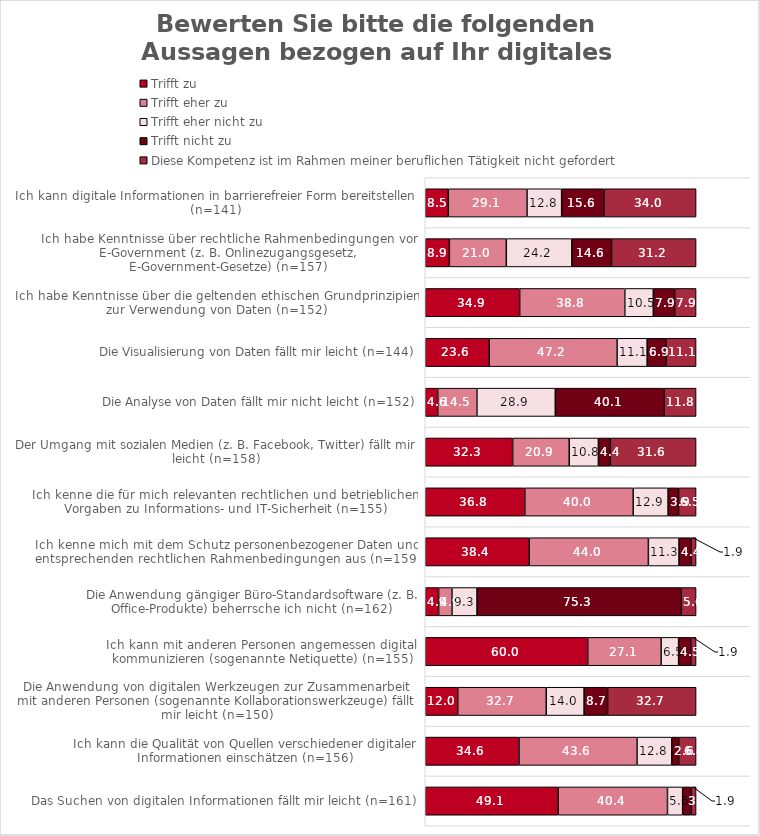
| Category | Trifft zu | Trifft eher zu | Trifft eher nicht zu | Trifft nicht zu | Diese Kompetenz ist im Rahmen meiner beruflichen Tätigkeit nicht gefordert |
|---|---|---|---|---|---|
| Das Suchen von digitalen Informationen fällt mir leicht (n=161) | 49.068 | 40.373 | 5.59 | 3.106 | 1.863 |
| Ich kann die Qualität von Quellen verschiedener digitaler Informationen einschätzen (n=156) | 34.615 | 43.59 | 12.821 | 2.564 | 6.41 |
| Die Anwendung von digitalen Werkzeugen zur Zusammenarbeit mit anderen Personen (sogenannte Kollaborationswerkzeuge) fällt mir leicht (n=150) | 12 | 32.667 | 14 | 8.667 | 32.667 |
| Ich kann mit anderen Personen angemessen digital kommunizieren (sogenannte Netiquette) (n=155) | 60 | 27.097 | 6.452 | 4.516 | 1.935 |
| Die Anwendung gängiger Büro-Standardsoftware (z. B. Office-Produkte) beherrsche ich nicht (n=162) | 4.938 | 4.938 | 9.259 | 75.309 | 5.556 |
| Ich kenne mich mit dem Schutz personenbezogener Daten und entsprechenden rechtlichen Rahmenbedingungen aus (n=159) | 38.365 | 44.025 | 11.321 | 4.403 | 1.887 |
| Ich kenne die für mich relevanten rechtlichen und betrieblichen Vorgaben zu Informations- und IT-Sicherheit (n=155) | 36.774 | 40 | 12.903 | 3.871 | 6.452 |
| Der Umgang mit sozialen Medien (z. B. Facebook, Twitter) fällt mir leicht (n=158) | 32.278 | 20.886 | 10.759 | 4.43 | 31.646 |
| Die Analyse von Daten fällt mir nicht leicht (n=152) | 4.605 | 14.474 | 28.947 | 40.132 | 11.842 |
| Die Visualisierung von Daten fällt mir leicht (n=144) | 23.611 | 47.222 | 11.111 | 6.944 | 11.111 |
| Ich habe Kenntnisse über die geltenden ethischen Grundprinzipien zur Verwendung von Daten (n=152) | 34.868 | 38.816 | 10.526 | 7.895 | 7.895 |
| Ich habe Kenntnisse über rechtliche Rahmenbedingungen von E-Government (z. B. Onlinezugangsgesetz, E-Government-Gesetze) (n=157) | 8.917 | 21.019 | 24.204 | 14.65 | 31.21 |
| Ich kann digitale Informationen in barrierefreier Form bereitstellen (n=141) | 8.511 | 29.078 | 12.766 | 15.603 | 34.043 |